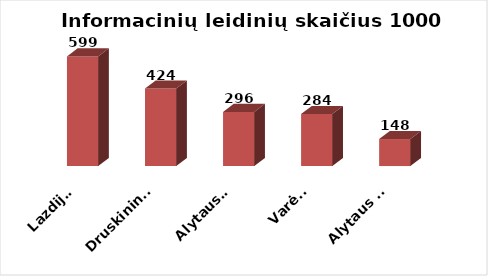
| Category | Series 0 |
|---|---|
| Lazdijai | 598.986 |
| Druskininkai | 423.55 |
| Alytaus r. | 295.973 |
| Varėna | 284.362 |
| Alytaus m. | 147.553 |